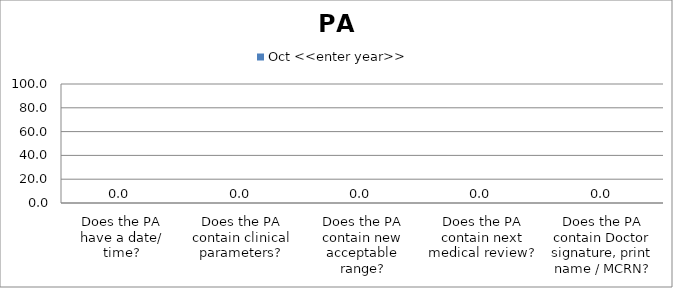
| Category | Oct <<enter year>> |
|---|---|
| Does the PA have a date/ time? | 0 |
| Does the PA contain clinical parameters? | 0 |
| Does the PA contain new acceptable range? | 0 |
| Does the PA contain next medical review? | 0 |
| Does the PA contain Doctor signature, print name / MCRN? | 0 |